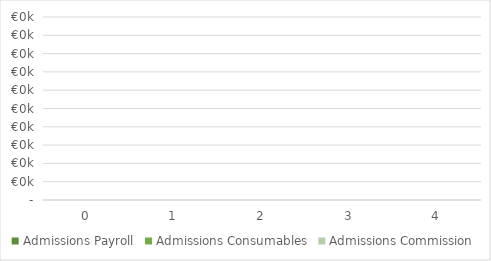
| Category | Admissions Payroll | Admissions Consumables | Admissions Commission |
|---|---|---|---|
| 0.0 | 0 | 0 | 0 |
| 1.0 | 0 | 0 | 0 |
| 2.0 | 0 | 0 | 0 |
| 3.0 | 0 | 0 | 0 |
| 4.0 | 0 | 0 | 0 |